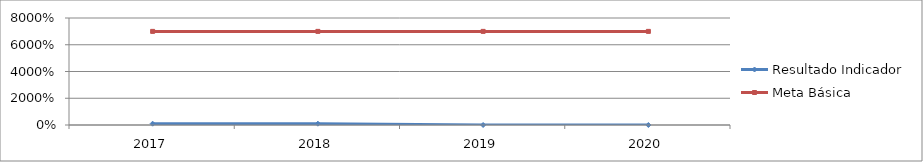
| Category | Resultado Indicador | Meta Básica |
|---|---|---|
| 2017 | 0.984 | 70 |
| 2018 | 0.994 | 70 |
| 2019 | 0 | 70 |
| 2020 | 0 | 70 |